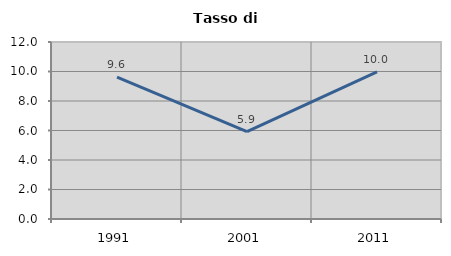
| Category | Tasso di disoccupazione   |
|---|---|
| 1991.0 | 9.618 |
| 2001.0 | 5.927 |
| 2011.0 | 9.98 |